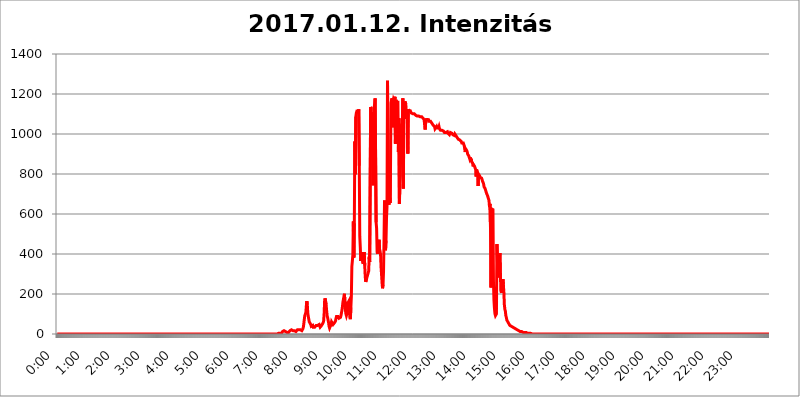
| Category | 2017.01.12. Intenzitás [W/m^2] |
|---|---|
| 0.0 | 0 |
| 0.0006944444444444445 | 0 |
| 0.001388888888888889 | 0 |
| 0.0020833333333333333 | 0 |
| 0.002777777777777778 | 0 |
| 0.003472222222222222 | 0 |
| 0.004166666666666667 | 0 |
| 0.004861111111111111 | 0 |
| 0.005555555555555556 | 0 |
| 0.0062499999999999995 | 0 |
| 0.006944444444444444 | 0 |
| 0.007638888888888889 | 0 |
| 0.008333333333333333 | 0 |
| 0.009027777777777779 | 0 |
| 0.009722222222222222 | 0 |
| 0.010416666666666666 | 0 |
| 0.011111111111111112 | 0 |
| 0.011805555555555555 | 0 |
| 0.012499999999999999 | 0 |
| 0.013194444444444444 | 0 |
| 0.013888888888888888 | 0 |
| 0.014583333333333332 | 0 |
| 0.015277777777777777 | 0 |
| 0.015972222222222224 | 0 |
| 0.016666666666666666 | 0 |
| 0.017361111111111112 | 0 |
| 0.018055555555555557 | 0 |
| 0.01875 | 0 |
| 0.019444444444444445 | 0 |
| 0.02013888888888889 | 0 |
| 0.020833333333333332 | 0 |
| 0.02152777777777778 | 0 |
| 0.022222222222222223 | 0 |
| 0.02291666666666667 | 0 |
| 0.02361111111111111 | 0 |
| 0.024305555555555556 | 0 |
| 0.024999999999999998 | 0 |
| 0.025694444444444447 | 0 |
| 0.02638888888888889 | 0 |
| 0.027083333333333334 | 0 |
| 0.027777777777777776 | 0 |
| 0.02847222222222222 | 0 |
| 0.029166666666666664 | 0 |
| 0.029861111111111113 | 0 |
| 0.030555555555555555 | 0 |
| 0.03125 | 0 |
| 0.03194444444444445 | 0 |
| 0.03263888888888889 | 0 |
| 0.03333333333333333 | 0 |
| 0.034027777777777775 | 0 |
| 0.034722222222222224 | 0 |
| 0.035416666666666666 | 0 |
| 0.036111111111111115 | 0 |
| 0.03680555555555556 | 0 |
| 0.0375 | 0 |
| 0.03819444444444444 | 0 |
| 0.03888888888888889 | 0 |
| 0.03958333333333333 | 0 |
| 0.04027777777777778 | 0 |
| 0.04097222222222222 | 0 |
| 0.041666666666666664 | 0 |
| 0.042361111111111106 | 0 |
| 0.04305555555555556 | 0 |
| 0.043750000000000004 | 0 |
| 0.044444444444444446 | 0 |
| 0.04513888888888889 | 0 |
| 0.04583333333333334 | 0 |
| 0.04652777777777778 | 0 |
| 0.04722222222222222 | 0 |
| 0.04791666666666666 | 0 |
| 0.04861111111111111 | 0 |
| 0.049305555555555554 | 0 |
| 0.049999999999999996 | 0 |
| 0.05069444444444445 | 0 |
| 0.051388888888888894 | 0 |
| 0.052083333333333336 | 0 |
| 0.05277777777777778 | 0 |
| 0.05347222222222222 | 0 |
| 0.05416666666666667 | 0 |
| 0.05486111111111111 | 0 |
| 0.05555555555555555 | 0 |
| 0.05625 | 0 |
| 0.05694444444444444 | 0 |
| 0.057638888888888885 | 0 |
| 0.05833333333333333 | 0 |
| 0.05902777777777778 | 0 |
| 0.059722222222222225 | 0 |
| 0.06041666666666667 | 0 |
| 0.061111111111111116 | 0 |
| 0.06180555555555556 | 0 |
| 0.0625 | 0 |
| 0.06319444444444444 | 0 |
| 0.06388888888888888 | 0 |
| 0.06458333333333334 | 0 |
| 0.06527777777777778 | 0 |
| 0.06597222222222222 | 0 |
| 0.06666666666666667 | 0 |
| 0.06736111111111111 | 0 |
| 0.06805555555555555 | 0 |
| 0.06874999999999999 | 0 |
| 0.06944444444444443 | 0 |
| 0.07013888888888889 | 0 |
| 0.07083333333333333 | 0 |
| 0.07152777777777779 | 0 |
| 0.07222222222222223 | 0 |
| 0.07291666666666667 | 0 |
| 0.07361111111111111 | 0 |
| 0.07430555555555556 | 0 |
| 0.075 | 0 |
| 0.07569444444444444 | 0 |
| 0.0763888888888889 | 0 |
| 0.07708333333333334 | 0 |
| 0.07777777777777778 | 0 |
| 0.07847222222222222 | 0 |
| 0.07916666666666666 | 0 |
| 0.0798611111111111 | 0 |
| 0.08055555555555556 | 0 |
| 0.08125 | 0 |
| 0.08194444444444444 | 0 |
| 0.08263888888888889 | 0 |
| 0.08333333333333333 | 0 |
| 0.08402777777777777 | 0 |
| 0.08472222222222221 | 0 |
| 0.08541666666666665 | 0 |
| 0.08611111111111112 | 0 |
| 0.08680555555555557 | 0 |
| 0.08750000000000001 | 0 |
| 0.08819444444444445 | 0 |
| 0.08888888888888889 | 0 |
| 0.08958333333333333 | 0 |
| 0.09027777777777778 | 0 |
| 0.09097222222222222 | 0 |
| 0.09166666666666667 | 0 |
| 0.09236111111111112 | 0 |
| 0.09305555555555556 | 0 |
| 0.09375 | 0 |
| 0.09444444444444444 | 0 |
| 0.09513888888888888 | 0 |
| 0.09583333333333333 | 0 |
| 0.09652777777777777 | 0 |
| 0.09722222222222222 | 0 |
| 0.09791666666666667 | 0 |
| 0.09861111111111111 | 0 |
| 0.09930555555555555 | 0 |
| 0.09999999999999999 | 0 |
| 0.10069444444444443 | 0 |
| 0.1013888888888889 | 0 |
| 0.10208333333333335 | 0 |
| 0.10277777777777779 | 0 |
| 0.10347222222222223 | 0 |
| 0.10416666666666667 | 0 |
| 0.10486111111111111 | 0 |
| 0.10555555555555556 | 0 |
| 0.10625 | 0 |
| 0.10694444444444444 | 0 |
| 0.1076388888888889 | 0 |
| 0.10833333333333334 | 0 |
| 0.10902777777777778 | 0 |
| 0.10972222222222222 | 0 |
| 0.1111111111111111 | 0 |
| 0.11180555555555556 | 0 |
| 0.11180555555555556 | 0 |
| 0.1125 | 0 |
| 0.11319444444444444 | 0 |
| 0.11388888888888889 | 0 |
| 0.11458333333333333 | 0 |
| 0.11527777777777777 | 0 |
| 0.11597222222222221 | 0 |
| 0.11666666666666665 | 0 |
| 0.1173611111111111 | 0 |
| 0.11805555555555557 | 0 |
| 0.11944444444444445 | 0 |
| 0.12013888888888889 | 0 |
| 0.12083333333333333 | 0 |
| 0.12152777777777778 | 0 |
| 0.12222222222222223 | 0 |
| 0.12291666666666667 | 0 |
| 0.12291666666666667 | 0 |
| 0.12361111111111112 | 0 |
| 0.12430555555555556 | 0 |
| 0.125 | 0 |
| 0.12569444444444444 | 0 |
| 0.12638888888888888 | 0 |
| 0.12708333333333333 | 0 |
| 0.16875 | 0 |
| 0.12847222222222224 | 0 |
| 0.12916666666666668 | 0 |
| 0.12986111111111112 | 0 |
| 0.13055555555555556 | 0 |
| 0.13125 | 0 |
| 0.13194444444444445 | 0 |
| 0.1326388888888889 | 0 |
| 0.13333333333333333 | 0 |
| 0.13402777777777777 | 0 |
| 0.13402777777777777 | 0 |
| 0.13472222222222222 | 0 |
| 0.13541666666666666 | 0 |
| 0.1361111111111111 | 0 |
| 0.13749999999999998 | 0 |
| 0.13819444444444443 | 0 |
| 0.1388888888888889 | 0 |
| 0.13958333333333334 | 0 |
| 0.14027777777777778 | 0 |
| 0.14097222222222222 | 0 |
| 0.14166666666666666 | 0 |
| 0.1423611111111111 | 0 |
| 0.14305555555555557 | 0 |
| 0.14375000000000002 | 0 |
| 0.14444444444444446 | 0 |
| 0.1451388888888889 | 0 |
| 0.1451388888888889 | 0 |
| 0.14652777777777778 | 0 |
| 0.14722222222222223 | 0 |
| 0.14791666666666667 | 0 |
| 0.1486111111111111 | 0 |
| 0.14930555555555555 | 0 |
| 0.15 | 0 |
| 0.15069444444444444 | 0 |
| 0.15138888888888888 | 0 |
| 0.15208333333333332 | 0 |
| 0.15277777777777776 | 0 |
| 0.15347222222222223 | 0 |
| 0.15416666666666667 | 0 |
| 0.15486111111111112 | 0 |
| 0.15555555555555556 | 0 |
| 0.15625 | 0 |
| 0.15694444444444444 | 0 |
| 0.15763888888888888 | 0 |
| 0.15833333333333333 | 0 |
| 0.15902777777777777 | 0 |
| 0.15972222222222224 | 0 |
| 0.16041666666666668 | 0 |
| 0.16111111111111112 | 0 |
| 0.16180555555555556 | 0 |
| 0.1625 | 0 |
| 0.16319444444444445 | 0 |
| 0.1638888888888889 | 0 |
| 0.16458333333333333 | 0 |
| 0.16527777777777777 | 0 |
| 0.16597222222222222 | 0 |
| 0.16666666666666666 | 0 |
| 0.1673611111111111 | 0 |
| 0.16805555555555554 | 0 |
| 0.16874999999999998 | 0 |
| 0.16944444444444443 | 0 |
| 0.17013888888888887 | 0 |
| 0.1708333333333333 | 0 |
| 0.17152777777777775 | 0 |
| 0.17222222222222225 | 0 |
| 0.1729166666666667 | 0 |
| 0.17361111111111113 | 0 |
| 0.17430555555555557 | 0 |
| 0.17500000000000002 | 0 |
| 0.17569444444444446 | 0 |
| 0.1763888888888889 | 0 |
| 0.17708333333333334 | 0 |
| 0.17777777777777778 | 0 |
| 0.17847222222222223 | 0 |
| 0.17916666666666667 | 0 |
| 0.1798611111111111 | 0 |
| 0.18055555555555555 | 0 |
| 0.18125 | 0 |
| 0.18194444444444444 | 0 |
| 0.1826388888888889 | 0 |
| 0.18333333333333335 | 0 |
| 0.1840277777777778 | 0 |
| 0.18472222222222223 | 0 |
| 0.18541666666666667 | 0 |
| 0.18611111111111112 | 0 |
| 0.18680555555555556 | 0 |
| 0.1875 | 0 |
| 0.18819444444444444 | 0 |
| 0.18888888888888888 | 0 |
| 0.18958333333333333 | 0 |
| 0.19027777777777777 | 0 |
| 0.1909722222222222 | 0 |
| 0.19166666666666665 | 0 |
| 0.19236111111111112 | 0 |
| 0.19305555555555554 | 0 |
| 0.19375 | 0 |
| 0.19444444444444445 | 0 |
| 0.1951388888888889 | 0 |
| 0.19583333333333333 | 0 |
| 0.19652777777777777 | 0 |
| 0.19722222222222222 | 0 |
| 0.19791666666666666 | 0 |
| 0.1986111111111111 | 0 |
| 0.19930555555555554 | 0 |
| 0.19999999999999998 | 0 |
| 0.20069444444444443 | 0 |
| 0.20138888888888887 | 0 |
| 0.2020833333333333 | 0 |
| 0.2027777777777778 | 0 |
| 0.2034722222222222 | 0 |
| 0.2041666666666667 | 0 |
| 0.20486111111111113 | 0 |
| 0.20555555555555557 | 0 |
| 0.20625000000000002 | 0 |
| 0.20694444444444446 | 0 |
| 0.2076388888888889 | 0 |
| 0.20833333333333334 | 0 |
| 0.20902777777777778 | 0 |
| 0.20972222222222223 | 0 |
| 0.21041666666666667 | 0 |
| 0.2111111111111111 | 0 |
| 0.21180555555555555 | 0 |
| 0.2125 | 0 |
| 0.21319444444444444 | 0 |
| 0.2138888888888889 | 0 |
| 0.21458333333333335 | 0 |
| 0.2152777777777778 | 0 |
| 0.21597222222222223 | 0 |
| 0.21666666666666667 | 0 |
| 0.21736111111111112 | 0 |
| 0.21805555555555556 | 0 |
| 0.21875 | 0 |
| 0.21944444444444444 | 0 |
| 0.22013888888888888 | 0 |
| 0.22083333333333333 | 0 |
| 0.22152777777777777 | 0 |
| 0.2222222222222222 | 0 |
| 0.22291666666666665 | 0 |
| 0.2236111111111111 | 0 |
| 0.22430555555555556 | 0 |
| 0.225 | 0 |
| 0.22569444444444445 | 0 |
| 0.2263888888888889 | 0 |
| 0.22708333333333333 | 0 |
| 0.22777777777777777 | 0 |
| 0.22847222222222222 | 0 |
| 0.22916666666666666 | 0 |
| 0.2298611111111111 | 0 |
| 0.23055555555555554 | 0 |
| 0.23124999999999998 | 0 |
| 0.23194444444444443 | 0 |
| 0.23263888888888887 | 0 |
| 0.2333333333333333 | 0 |
| 0.2340277777777778 | 0 |
| 0.2347222222222222 | 0 |
| 0.2354166666666667 | 0 |
| 0.23611111111111113 | 0 |
| 0.23680555555555557 | 0 |
| 0.23750000000000002 | 0 |
| 0.23819444444444446 | 0 |
| 0.2388888888888889 | 0 |
| 0.23958333333333334 | 0 |
| 0.24027777777777778 | 0 |
| 0.24097222222222223 | 0 |
| 0.24166666666666667 | 0 |
| 0.2423611111111111 | 0 |
| 0.24305555555555555 | 0 |
| 0.24375 | 0 |
| 0.24444444444444446 | 0 |
| 0.24513888888888888 | 0 |
| 0.24583333333333335 | 0 |
| 0.2465277777777778 | 0 |
| 0.24722222222222223 | 0 |
| 0.24791666666666667 | 0 |
| 0.24861111111111112 | 0 |
| 0.24930555555555556 | 0 |
| 0.25 | 0 |
| 0.25069444444444444 | 0 |
| 0.2513888888888889 | 0 |
| 0.2520833333333333 | 0 |
| 0.25277777777777777 | 0 |
| 0.2534722222222222 | 0 |
| 0.25416666666666665 | 0 |
| 0.2548611111111111 | 0 |
| 0.2555555555555556 | 0 |
| 0.25625000000000003 | 0 |
| 0.2569444444444445 | 0 |
| 0.2576388888888889 | 0 |
| 0.25833333333333336 | 0 |
| 0.2590277777777778 | 0 |
| 0.25972222222222224 | 0 |
| 0.2604166666666667 | 0 |
| 0.2611111111111111 | 0 |
| 0.26180555555555557 | 0 |
| 0.2625 | 0 |
| 0.26319444444444445 | 0 |
| 0.2638888888888889 | 0 |
| 0.26458333333333334 | 0 |
| 0.2652777777777778 | 0 |
| 0.2659722222222222 | 0 |
| 0.26666666666666666 | 0 |
| 0.2673611111111111 | 0 |
| 0.26805555555555555 | 0 |
| 0.26875 | 0 |
| 0.26944444444444443 | 0 |
| 0.2701388888888889 | 0 |
| 0.2708333333333333 | 0 |
| 0.27152777777777776 | 0 |
| 0.2722222222222222 | 0 |
| 0.27291666666666664 | 0 |
| 0.2736111111111111 | 0 |
| 0.2743055555555555 | 0 |
| 0.27499999999999997 | 0 |
| 0.27569444444444446 | 0 |
| 0.27638888888888885 | 0 |
| 0.27708333333333335 | 0 |
| 0.2777777777777778 | 0 |
| 0.27847222222222223 | 0 |
| 0.2791666666666667 | 0 |
| 0.2798611111111111 | 0 |
| 0.28055555555555556 | 0 |
| 0.28125 | 0 |
| 0.28194444444444444 | 0 |
| 0.2826388888888889 | 0 |
| 0.2833333333333333 | 0 |
| 0.28402777777777777 | 0 |
| 0.2847222222222222 | 0 |
| 0.28541666666666665 | 0 |
| 0.28611111111111115 | 0 |
| 0.28680555555555554 | 0 |
| 0.28750000000000003 | 0 |
| 0.2881944444444445 | 0 |
| 0.2888888888888889 | 0 |
| 0.28958333333333336 | 0 |
| 0.2902777777777778 | 0 |
| 0.29097222222222224 | 0 |
| 0.2916666666666667 | 0 |
| 0.2923611111111111 | 0 |
| 0.29305555555555557 | 0 |
| 0.29375 | 0 |
| 0.29444444444444445 | 0 |
| 0.2951388888888889 | 0 |
| 0.29583333333333334 | 0 |
| 0.2965277777777778 | 0 |
| 0.2972222222222222 | 0 |
| 0.29791666666666666 | 0 |
| 0.2986111111111111 | 0 |
| 0.29930555555555555 | 0 |
| 0.3 | 0 |
| 0.30069444444444443 | 0 |
| 0.3013888888888889 | 0 |
| 0.3020833333333333 | 0 |
| 0.30277777777777776 | 0 |
| 0.3034722222222222 | 0 |
| 0.30416666666666664 | 0 |
| 0.3048611111111111 | 0 |
| 0.3055555555555555 | 0 |
| 0.30624999999999997 | 0 |
| 0.3069444444444444 | 0 |
| 0.3076388888888889 | 0 |
| 0.30833333333333335 | 0 |
| 0.3090277777777778 | 0 |
| 0.30972222222222223 | 3.525 |
| 0.3104166666666667 | 3.525 |
| 0.3111111111111111 | 3.525 |
| 0.31180555555555556 | 3.525 |
| 0.3125 | 3.525 |
| 0.31319444444444444 | 3.525 |
| 0.3138888888888889 | 7.887 |
| 0.3145833333333333 | 3.525 |
| 0.31527777777777777 | 7.887 |
| 0.3159722222222222 | 12.257 |
| 0.31666666666666665 | 16.636 |
| 0.31736111111111115 | 16.636 |
| 0.31805555555555554 | 16.636 |
| 0.31875000000000003 | 16.636 |
| 0.3194444444444445 | 16.636 |
| 0.3201388888888889 | 12.257 |
| 0.32083333333333336 | 12.257 |
| 0.3215277777777778 | 12.257 |
| 0.32222222222222224 | 7.887 |
| 0.3229166666666667 | 7.887 |
| 0.3236111111111111 | 7.887 |
| 0.32430555555555557 | 7.887 |
| 0.325 | 12.257 |
| 0.32569444444444445 | 12.257 |
| 0.3263888888888889 | 16.636 |
| 0.32708333333333334 | 21.024 |
| 0.3277777777777778 | 21.024 |
| 0.3284722222222222 | 21.024 |
| 0.32916666666666666 | 21.024 |
| 0.3298611111111111 | 21.024 |
| 0.33055555555555555 | 16.636 |
| 0.33125 | 16.636 |
| 0.33194444444444443 | 16.636 |
| 0.3326388888888889 | 16.636 |
| 0.3333333333333333 | 12.257 |
| 0.3340277777777778 | 12.257 |
| 0.3347222222222222 | 12.257 |
| 0.3354166666666667 | 16.636 |
| 0.3361111111111111 | 16.636 |
| 0.3368055555555556 | 21.024 |
| 0.33749999999999997 | 21.024 |
| 0.33819444444444446 | 21.024 |
| 0.33888888888888885 | 21.024 |
| 0.33958333333333335 | 21.024 |
| 0.34027777777777773 | 21.024 |
| 0.34097222222222223 | 21.024 |
| 0.3416666666666666 | 16.636 |
| 0.3423611111111111 | 16.636 |
| 0.3430555555555555 | 16.636 |
| 0.34375 | 21.024 |
| 0.3444444444444445 | 25.419 |
| 0.3451388888888889 | 34.234 |
| 0.3458333333333334 | 51.951 |
| 0.34652777777777777 | 74.246 |
| 0.34722222222222227 | 92.184 |
| 0.34791666666666665 | 92.184 |
| 0.34861111111111115 | 105.69 |
| 0.34930555555555554 | 137.347 |
| 0.35000000000000003 | 164.605 |
| 0.3506944444444444 | 146.423 |
| 0.3513888888888889 | 105.69 |
| 0.3520833333333333 | 87.692 |
| 0.3527777777777778 | 74.246 |
| 0.3534722222222222 | 60.85 |
| 0.3541666666666667 | 56.398 |
| 0.3548611111111111 | 56.398 |
| 0.35555555555555557 | 47.511 |
| 0.35625 | 38.653 |
| 0.35694444444444445 | 43.079 |
| 0.3576388888888889 | 43.079 |
| 0.35833333333333334 | 43.079 |
| 0.3590277777777778 | 34.234 |
| 0.3597222222222222 | 29.823 |
| 0.36041666666666666 | 29.823 |
| 0.3611111111111111 | 34.234 |
| 0.36180555555555555 | 38.653 |
| 0.3625 | 38.653 |
| 0.36319444444444443 | 43.079 |
| 0.3638888888888889 | 43.079 |
| 0.3645833333333333 | 43.079 |
| 0.3652777777777778 | 43.079 |
| 0.3659722222222222 | 38.653 |
| 0.3666666666666667 | 47.511 |
| 0.3673611111111111 | 47.511 |
| 0.3680555555555556 | 47.511 |
| 0.36874999999999997 | 34.234 |
| 0.36944444444444446 | 29.823 |
| 0.37013888888888885 | 38.653 |
| 0.37083333333333335 | 43.079 |
| 0.37152777777777773 | 47.511 |
| 0.37222222222222223 | 47.511 |
| 0.3729166666666666 | 56.398 |
| 0.3736111111111111 | 65.31 |
| 0.3743055555555555 | 101.184 |
| 0.375 | 164.605 |
| 0.3756944444444445 | 178.264 |
| 0.3763888888888889 | 173.709 |
| 0.3770833333333334 | 146.423 |
| 0.37777777777777777 | 119.235 |
| 0.37847222222222227 | 92.184 |
| 0.37916666666666665 | 83.205 |
| 0.37986111111111115 | 78.722 |
| 0.38055555555555554 | 56.398 |
| 0.38125000000000003 | 38.653 |
| 0.3819444444444444 | 29.823 |
| 0.3826388888888889 | 25.419 |
| 0.3833333333333333 | 29.823 |
| 0.3840277777777778 | 47.511 |
| 0.3847222222222222 | 60.85 |
| 0.3854166666666667 | 56.398 |
| 0.3861111111111111 | 56.398 |
| 0.38680555555555557 | 47.511 |
| 0.3875 | 43.079 |
| 0.38819444444444445 | 51.951 |
| 0.3888888888888889 | 56.398 |
| 0.38958333333333334 | 56.398 |
| 0.3902777777777778 | 65.31 |
| 0.3909722222222222 | 78.722 |
| 0.39166666666666666 | 87.692 |
| 0.3923611111111111 | 87.692 |
| 0.39305555555555555 | 92.184 |
| 0.39375 | 87.692 |
| 0.39444444444444443 | 92.184 |
| 0.3951388888888889 | 78.722 |
| 0.3958333333333333 | 78.722 |
| 0.3965277777777778 | 78.722 |
| 0.3972222222222222 | 83.205 |
| 0.3979166666666667 | 92.184 |
| 0.3986111111111111 | 105.69 |
| 0.3993055555555556 | 119.235 |
| 0.39999999999999997 | 137.347 |
| 0.40069444444444446 | 160.056 |
| 0.40138888888888885 | 173.709 |
| 0.40208333333333335 | 187.378 |
| 0.40277777777777773 | 201.058 |
| 0.40347222222222223 | 196.497 |
| 0.4041666666666666 | 119.235 |
| 0.4048611111111111 | 101.184 |
| 0.4055555555555555 | 92.184 |
| 0.40625 | 101.184 |
| 0.4069444444444445 | 119.235 |
| 0.4076388888888889 | 155.509 |
| 0.4083333333333334 | 155.509 |
| 0.40902777777777777 | 164.605 |
| 0.40972222222222227 | 137.347 |
| 0.41041666666666665 | 83.205 |
| 0.41111111111111115 | 74.246 |
| 0.41180555555555554 | 132.814 |
| 0.41250000000000003 | 187.378 |
| 0.4131944444444444 | 337.639 |
| 0.4138888888888889 | 364.728 |
| 0.4145833333333333 | 396.164 |
| 0.4152777777777778 | 562.53 |
| 0.4159722222222222 | 382.715 |
| 0.4166666666666667 | 553.986 |
| 0.4173611111111111 | 962.555 |
| 0.41805555555555557 | 798.974 |
| 0.41875 | 1086.097 |
| 0.41944444444444445 | 1105.019 |
| 0.4201388888888889 | 1112.618 |
| 0.42083333333333334 | 1112.618 |
| 0.4215277777777778 | 1112.618 |
| 0.4222222222222222 | 1108.816 |
| 0.42291666666666666 | 1124.056 |
| 0.4236111111111111 | 841.526 |
| 0.42430555555555555 | 489.108 |
| 0.425 | 436.27 |
| 0.42569444444444443 | 364.728 |
| 0.4263888888888889 | 364.728 |
| 0.4270833333333333 | 409.574 |
| 0.4277777777777778 | 373.729 |
| 0.4284722222222222 | 360.221 |
| 0.4291666666666667 | 351.198 |
| 0.4298611111111111 | 391.685 |
| 0.4305555555555556 | 409.574 |
| 0.43124999999999997 | 342.162 |
| 0.43194444444444446 | 287.709 |
| 0.43263888888888885 | 260.373 |
| 0.43333333333333335 | 255.813 |
| 0.43402777777777773 | 278.603 |
| 0.43472222222222223 | 287.709 |
| 0.4354166666666666 | 287.709 |
| 0.4361111111111111 | 287.709 |
| 0.4368055555555555 | 314.98 |
| 0.4375 | 387.202 |
| 0.4381944444444445 | 360.221 |
| 0.4388888888888889 | 360.221 |
| 0.4395833333333334 | 1135.543 |
| 0.44027777777777777 | 1127.879 |
| 0.44097222222222227 | 1082.324 |
| 0.44166666666666665 | 1093.653 |
| 0.44236111111111115 | 1108.816 |
| 0.44305555555555554 | 743.859 |
| 0.44375000000000003 | 806.757 |
| 0.4444444444444444 | 1127.879 |
| 0.4451388888888889 | 1150.946 |
| 0.4458333333333333 | 1178.177 |
| 0.4465277777777778 | 1178.177 |
| 0.4472222222222222 | 558.261 |
| 0.4479166666666667 | 528.2 |
| 0.4486111111111111 | 409.574 |
| 0.44930555555555557 | 400.638 |
| 0.45 | 396.164 |
| 0.45069444444444445 | 445.129 |
| 0.4513888888888889 | 471.582 |
| 0.45208333333333334 | 422.943 |
| 0.4527777777777778 | 414.035 |
| 0.4534722222222222 | 396.164 |
| 0.45416666666666666 | 333.113 |
| 0.4548611111111111 | 296.808 |
| 0.45555555555555555 | 255.813 |
| 0.45625 | 228.436 |
| 0.45694444444444443 | 246.689 |
| 0.4576388888888889 | 314.98 |
| 0.4583333333333333 | 475.972 |
| 0.4590277777777778 | 667.123 |
| 0.4597222222222222 | 497.836 |
| 0.4604166666666667 | 418.492 |
| 0.4611111111111111 | 467.187 |
| 0.4618055555555556 | 579.542 |
| 0.46249999999999997 | 638.256 |
| 0.46319444444444446 | 1266.8 |
| 0.46388888888888885 | 849.199 |
| 0.46458333333333335 | 683.473 |
| 0.46527777777777773 | 646.537 |
| 0.46597222222222223 | 783.342 |
| 0.4666666666666666 | 654.791 |
| 0.4673611111111111 | 806.757 |
| 0.4680555555555555 | 1154.814 |
| 0.46875 | 1158.689 |
| 0.4694444444444445 | 1178.177 |
| 0.4701388888888889 | 1033.537 |
| 0.4708333333333334 | 1162.571 |
| 0.47152777777777777 | 1174.263 |
| 0.47222222222222227 | 1178.177 |
| 0.47291666666666665 | 1162.571 |
| 0.47361111111111115 | 1186.03 |
| 0.47430555555555554 | 951.327 |
| 0.47500000000000003 | 1170.358 |
| 0.4756944444444444 | 1158.689 |
| 0.4763888888888889 | 1162.571 |
| 0.4770833333333333 | 1154.814 |
| 0.4777777777777778 | 1158.689 |
| 0.4784722222222222 | 909.996 |
| 0.4791666666666667 | 1078.555 |
| 0.4798611111111111 | 650.667 |
| 0.48055555555555557 | 747.834 |
| 0.48125 | 791.169 |
| 0.48194444444444445 | 1037.277 |
| 0.4826388888888889 | 1037.277 |
| 0.48333333333333334 | 1041.019 |
| 0.4840277777777778 | 1056.004 |
| 0.4847222222222222 | 1178.177 |
| 0.48541666666666666 | 727.896 |
| 0.4861111111111111 | 1127.879 |
| 0.48680555555555555 | 1135.543 |
| 0.4875 | 1162.571 |
| 0.48819444444444443 | 1162.571 |
| 0.4888888888888889 | 1150.946 |
| 0.4895833333333333 | 1074.789 |
| 0.4902777777777778 | 1101.226 |
| 0.4909722222222222 | 1124.056 |
| 0.4916666666666667 | 902.447 |
| 0.4923611111111111 | 1124.056 |
| 0.4930555555555556 | 1116.426 |
| 0.49374999999999997 | 1120.238 |
| 0.49444444444444446 | 1116.426 |
| 0.49513888888888885 | 1116.426 |
| 0.49583333333333335 | 1112.618 |
| 0.49652777777777773 | 1105.019 |
| 0.49722222222222223 | 1101.226 |
| 0.4979166666666666 | 1101.226 |
| 0.4986111111111111 | 1101.226 |
| 0.4993055555555555 | 1097.437 |
| 0.5 | 1097.437 |
| 0.5006944444444444 | 1101.226 |
| 0.5013888888888889 | 1097.437 |
| 0.5020833333333333 | 1097.437 |
| 0.5027777777777778 | 1093.653 |
| 0.5034722222222222 | 1089.873 |
| 0.5041666666666667 | 1089.873 |
| 0.5048611111111111 | 1089.873 |
| 0.5055555555555555 | 1086.097 |
| 0.50625 | 1093.653 |
| 0.5069444444444444 | 1089.873 |
| 0.5076388888888889 | 1093.653 |
| 0.5083333333333333 | 1089.873 |
| 0.5090277777777777 | 1086.097 |
| 0.5097222222222222 | 1082.324 |
| 0.5104166666666666 | 1086.097 |
| 0.5111111111111112 | 1086.097 |
| 0.5118055555555555 | 1082.324 |
| 0.5125000000000001 | 1082.324 |
| 0.5131944444444444 | 1078.555 |
| 0.513888888888889 | 1078.555 |
| 0.5145833333333333 | 1071.027 |
| 0.5152777777777778 | 1044.762 |
| 0.5159722222222222 | 1022.323 |
| 0.5166666666666667 | 1052.255 |
| 0.517361111111111 | 1059.756 |
| 0.5180555555555556 | 1078.555 |
| 0.5187499999999999 | 1071.027 |
| 0.5194444444444445 | 1067.267 |
| 0.5201388888888888 | 1067.267 |
| 0.5208333333333334 | 1071.027 |
| 0.5215277777777778 | 1063.51 |
| 0.5222222222222223 | 1059.756 |
| 0.5229166666666667 | 1059.756 |
| 0.5236111111111111 | 1063.51 |
| 0.5243055555555556 | 1059.756 |
| 0.525 | 1056.004 |
| 0.5256944444444445 | 1052.255 |
| 0.5263888888888889 | 1052.255 |
| 0.5270833333333333 | 1044.762 |
| 0.5277777777777778 | 1044.762 |
| 0.5284722222222222 | 1041.019 |
| 0.5291666666666667 | 1037.277 |
| 0.5298611111111111 | 1026.06 |
| 0.5305555555555556 | 1029.798 |
| 0.53125 | 1029.798 |
| 0.5319444444444444 | 1037.277 |
| 0.5326388888888889 | 1029.798 |
| 0.5333333333333333 | 1029.798 |
| 0.5340277777777778 | 1033.537 |
| 0.5347222222222222 | 1029.798 |
| 0.5354166666666667 | 1037.277 |
| 0.5361111111111111 | 1026.06 |
| 0.5368055555555555 | 1029.798 |
| 0.5375 | 1018.587 |
| 0.5381944444444444 | 1018.587 |
| 0.5388888888888889 | 1014.852 |
| 0.5395833333333333 | 1018.587 |
| 0.5402777777777777 | 1014.852 |
| 0.5409722222222222 | 1022.323 |
| 0.5416666666666666 | 1014.852 |
| 0.5423611111111112 | 1011.118 |
| 0.5430555555555555 | 1007.383 |
| 0.5437500000000001 | 1007.383 |
| 0.5444444444444444 | 1007.383 |
| 0.545138888888889 | 1007.383 |
| 0.5458333333333333 | 1007.383 |
| 0.5465277777777778 | 1011.118 |
| 0.5472222222222222 | 1011.118 |
| 0.5479166666666667 | 1003.65 |
| 0.548611111111111 | 1007.383 |
| 0.5493055555555556 | 1003.65 |
| 0.5499999999999999 | 996.182 |
| 0.5506944444444445 | 999.916 |
| 0.5513888888888888 | 1007.383 |
| 0.5520833333333334 | 1007.383 |
| 0.5527777777777778 | 1011.118 |
| 0.5534722222222223 | 1003.65 |
| 0.5541666666666667 | 999.916 |
| 0.5548611111111111 | 996.182 |
| 0.5555555555555556 | 996.182 |
| 0.55625 | 996.182 |
| 0.5569444444444445 | 992.448 |
| 0.5576388888888889 | 999.916 |
| 0.5583333333333333 | 999.916 |
| 0.5590277777777778 | 992.448 |
| 0.5597222222222222 | 992.448 |
| 0.5604166666666667 | 988.714 |
| 0.5611111111111111 | 981.244 |
| 0.5618055555555556 | 977.508 |
| 0.5625 | 973.772 |
| 0.5631944444444444 | 977.508 |
| 0.5638888888888889 | 973.772 |
| 0.5645833333333333 | 970.034 |
| 0.5652777777777778 | 966.295 |
| 0.5659722222222222 | 966.295 |
| 0.5666666666666667 | 962.555 |
| 0.5673611111111111 | 955.071 |
| 0.5680555555555555 | 955.071 |
| 0.56875 | 958.814 |
| 0.5694444444444444 | 955.071 |
| 0.5701388888888889 | 951.327 |
| 0.5708333333333333 | 940.082 |
| 0.5715277777777777 | 925.06 |
| 0.5722222222222222 | 909.996 |
| 0.5729166666666666 | 925.06 |
| 0.5736111111111112 | 921.298 |
| 0.5743055555555555 | 917.534 |
| 0.5750000000000001 | 909.996 |
| 0.5756944444444444 | 898.668 |
| 0.576388888888889 | 894.885 |
| 0.5770833333333333 | 891.099 |
| 0.5777777777777778 | 887.309 |
| 0.5784722222222222 | 875.918 |
| 0.5791666666666667 | 883.516 |
| 0.579861111111111 | 868.305 |
| 0.5805555555555556 | 875.918 |
| 0.5812499999999999 | 860.676 |
| 0.5819444444444445 | 860.676 |
| 0.5826388888888888 | 853.029 |
| 0.5833333333333334 | 837.682 |
| 0.5840277777777778 | 845.365 |
| 0.5847222222222223 | 841.526 |
| 0.5854166666666667 | 837.682 |
| 0.5861111111111111 | 829.981 |
| 0.5868055555555556 | 822.26 |
| 0.5875 | 787.258 |
| 0.5881944444444445 | 822.26 |
| 0.5888888888888889 | 810.641 |
| 0.5895833333333333 | 802.868 |
| 0.5902777777777778 | 739.877 |
| 0.5909722222222222 | 798.974 |
| 0.5916666666666667 | 802.868 |
| 0.5923611111111111 | 791.169 |
| 0.5930555555555556 | 783.342 |
| 0.59375 | 779.42 |
| 0.5944444444444444 | 779.42 |
| 0.5951388888888889 | 779.42 |
| 0.5958333333333333 | 771.559 |
| 0.5965277777777778 | 763.674 |
| 0.5972222222222222 | 759.723 |
| 0.5979166666666667 | 751.803 |
| 0.5986111111111111 | 735.89 |
| 0.5993055555555555 | 731.896 |
| 0.6 | 727.896 |
| 0.6006944444444444 | 719.877 |
| 0.6013888888888889 | 711.832 |
| 0.6020833333333333 | 703.762 |
| 0.6027777777777777 | 699.717 |
| 0.6034722222222222 | 691.608 |
| 0.6041666666666666 | 683.473 |
| 0.6048611111111112 | 683.473 |
| 0.6055555555555555 | 667.123 |
| 0.6062500000000001 | 634.105 |
| 0.6069444444444444 | 650.667 |
| 0.607638888888889 | 532.513 |
| 0.6083333333333333 | 233 |
| 0.6090277777777778 | 625.784 |
| 0.6097222222222222 | 629.948 |
| 0.6104166666666667 | 629.948 |
| 0.611111111111111 | 621.613 |
| 0.6118055555555556 | 260.373 |
| 0.6124999999999999 | 169.156 |
| 0.6131944444444445 | 128.284 |
| 0.6138888888888888 | 101.184 |
| 0.6145833333333334 | 92.184 |
| 0.6152777777777778 | 87.692 |
| 0.6159722222222223 | 101.184 |
| 0.6166666666666667 | 449.551 |
| 0.6173611111111111 | 453.968 |
| 0.6180555555555556 | 283.156 |
| 0.61875 | 405.108 |
| 0.6194444444444445 | 355.712 |
| 0.6201388888888889 | 382.715 |
| 0.6208333333333333 | 405.108 |
| 0.6215277777777778 | 301.354 |
| 0.6222222222222222 | 214.746 |
| 0.6229166666666667 | 205.62 |
| 0.6236111111111111 | 233 |
| 0.6243055555555556 | 219.309 |
| 0.625 | 274.047 |
| 0.6256944444444444 | 246.689 |
| 0.6263888888888889 | 210.182 |
| 0.6270833333333333 | 146.423 |
| 0.6277777777777778 | 123.758 |
| 0.6284722222222222 | 114.716 |
| 0.6291666666666667 | 92.184 |
| 0.6298611111111111 | 83.205 |
| 0.6305555555555555 | 69.775 |
| 0.63125 | 65.31 |
| 0.6319444444444444 | 60.85 |
| 0.6326388888888889 | 56.398 |
| 0.6333333333333333 | 51.951 |
| 0.6340277777777777 | 47.511 |
| 0.6347222222222222 | 43.079 |
| 0.6354166666666666 | 38.653 |
| 0.6361111111111112 | 38.653 |
| 0.6368055555555555 | 38.653 |
| 0.6375000000000001 | 34.234 |
| 0.6381944444444444 | 34.234 |
| 0.638888888888889 | 34.234 |
| 0.6395833333333333 | 34.234 |
| 0.6402777777777778 | 29.823 |
| 0.6409722222222222 | 29.823 |
| 0.6416666666666667 | 25.419 |
| 0.642361111111111 | 25.419 |
| 0.6430555555555556 | 25.419 |
| 0.6437499999999999 | 21.024 |
| 0.6444444444444445 | 21.024 |
| 0.6451388888888888 | 21.024 |
| 0.6458333333333334 | 16.636 |
| 0.6465277777777778 | 16.636 |
| 0.6472222222222223 | 16.636 |
| 0.6479166666666667 | 12.257 |
| 0.6486111111111111 | 12.257 |
| 0.6493055555555556 | 12.257 |
| 0.65 | 12.257 |
| 0.6506944444444445 | 12.257 |
| 0.6513888888888889 | 12.257 |
| 0.6520833333333333 | 7.887 |
| 0.6527777777777778 | 7.887 |
| 0.6534722222222222 | 7.887 |
| 0.6541666666666667 | 7.887 |
| 0.6548611111111111 | 7.887 |
| 0.6555555555555556 | 7.887 |
| 0.65625 | 7.887 |
| 0.6569444444444444 | 7.887 |
| 0.6576388888888889 | 7.887 |
| 0.6583333333333333 | 3.525 |
| 0.6590277777777778 | 3.525 |
| 0.6597222222222222 | 3.525 |
| 0.6604166666666667 | 3.525 |
| 0.6611111111111111 | 3.525 |
| 0.6618055555555555 | 3.525 |
| 0.6625 | 3.525 |
| 0.6631944444444444 | 3.525 |
| 0.6638888888888889 | 3.525 |
| 0.6645833333333333 | 3.525 |
| 0.6652777777777777 | 3.525 |
| 0.6659722222222222 | 0 |
| 0.6666666666666666 | 0 |
| 0.6673611111111111 | 0 |
| 0.6680555555555556 | 0 |
| 0.6687500000000001 | 0 |
| 0.6694444444444444 | 0 |
| 0.6701388888888888 | 0 |
| 0.6708333333333334 | 0 |
| 0.6715277777777778 | 0 |
| 0.6722222222222222 | 0 |
| 0.6729166666666666 | 0 |
| 0.6736111111111112 | 0 |
| 0.6743055555555556 | 0 |
| 0.6749999999999999 | 0 |
| 0.6756944444444444 | 0 |
| 0.6763888888888889 | 0 |
| 0.6770833333333334 | 0 |
| 0.6777777777777777 | 0 |
| 0.6784722222222223 | 0 |
| 0.6791666666666667 | 0 |
| 0.6798611111111111 | 0 |
| 0.6805555555555555 | 0 |
| 0.68125 | 0 |
| 0.6819444444444445 | 0 |
| 0.6826388888888889 | 0 |
| 0.6833333333333332 | 0 |
| 0.6840277777777778 | 0 |
| 0.6847222222222222 | 0 |
| 0.6854166666666667 | 0 |
| 0.686111111111111 | 0 |
| 0.6868055555555556 | 0 |
| 0.6875 | 0 |
| 0.6881944444444444 | 0 |
| 0.688888888888889 | 0 |
| 0.6895833333333333 | 0 |
| 0.6902777777777778 | 0 |
| 0.6909722222222222 | 0 |
| 0.6916666666666668 | 0 |
| 0.6923611111111111 | 0 |
| 0.6930555555555555 | 0 |
| 0.69375 | 0 |
| 0.6944444444444445 | 0 |
| 0.6951388888888889 | 0 |
| 0.6958333333333333 | 0 |
| 0.6965277777777777 | 0 |
| 0.6972222222222223 | 0 |
| 0.6979166666666666 | 0 |
| 0.6986111111111111 | 0 |
| 0.6993055555555556 | 0 |
| 0.7000000000000001 | 0 |
| 0.7006944444444444 | 0 |
| 0.7013888888888888 | 0 |
| 0.7020833333333334 | 0 |
| 0.7027777777777778 | 0 |
| 0.7034722222222222 | 0 |
| 0.7041666666666666 | 0 |
| 0.7048611111111112 | 0 |
| 0.7055555555555556 | 0 |
| 0.7062499999999999 | 0 |
| 0.7069444444444444 | 0 |
| 0.7076388888888889 | 0 |
| 0.7083333333333334 | 0 |
| 0.7090277777777777 | 0 |
| 0.7097222222222223 | 0 |
| 0.7104166666666667 | 0 |
| 0.7111111111111111 | 0 |
| 0.7118055555555555 | 0 |
| 0.7125 | 0 |
| 0.7131944444444445 | 0 |
| 0.7138888888888889 | 0 |
| 0.7145833333333332 | 0 |
| 0.7152777777777778 | 0 |
| 0.7159722222222222 | 0 |
| 0.7166666666666667 | 0 |
| 0.717361111111111 | 0 |
| 0.7180555555555556 | 0 |
| 0.71875 | 0 |
| 0.7194444444444444 | 0 |
| 0.720138888888889 | 0 |
| 0.7208333333333333 | 0 |
| 0.7215277777777778 | 0 |
| 0.7222222222222222 | 0 |
| 0.7229166666666668 | 0 |
| 0.7236111111111111 | 0 |
| 0.7243055555555555 | 0 |
| 0.725 | 0 |
| 0.7256944444444445 | 0 |
| 0.7263888888888889 | 0 |
| 0.7270833333333333 | 0 |
| 0.7277777777777777 | 0 |
| 0.7284722222222223 | 0 |
| 0.7291666666666666 | 0 |
| 0.7298611111111111 | 0 |
| 0.7305555555555556 | 0 |
| 0.7312500000000001 | 0 |
| 0.7319444444444444 | 0 |
| 0.7326388888888888 | 0 |
| 0.7333333333333334 | 0 |
| 0.7340277777777778 | 0 |
| 0.7347222222222222 | 0 |
| 0.7354166666666666 | 0 |
| 0.7361111111111112 | 0 |
| 0.7368055555555556 | 0 |
| 0.7374999999999999 | 0 |
| 0.7381944444444444 | 0 |
| 0.7388888888888889 | 0 |
| 0.7395833333333334 | 0 |
| 0.7402777777777777 | 0 |
| 0.7409722222222223 | 0 |
| 0.7416666666666667 | 0 |
| 0.7423611111111111 | 0 |
| 0.7430555555555555 | 0 |
| 0.74375 | 0 |
| 0.7444444444444445 | 0 |
| 0.7451388888888889 | 0 |
| 0.7458333333333332 | 0 |
| 0.7465277777777778 | 0 |
| 0.7472222222222222 | 0 |
| 0.7479166666666667 | 0 |
| 0.748611111111111 | 0 |
| 0.7493055555555556 | 0 |
| 0.75 | 0 |
| 0.7506944444444444 | 0 |
| 0.751388888888889 | 0 |
| 0.7520833333333333 | 0 |
| 0.7527777777777778 | 0 |
| 0.7534722222222222 | 0 |
| 0.7541666666666668 | 0 |
| 0.7548611111111111 | 0 |
| 0.7555555555555555 | 0 |
| 0.75625 | 0 |
| 0.7569444444444445 | 0 |
| 0.7576388888888889 | 0 |
| 0.7583333333333333 | 0 |
| 0.7590277777777777 | 0 |
| 0.7597222222222223 | 0 |
| 0.7604166666666666 | 0 |
| 0.7611111111111111 | 0 |
| 0.7618055555555556 | 0 |
| 0.7625000000000001 | 0 |
| 0.7631944444444444 | 0 |
| 0.7638888888888888 | 0 |
| 0.7645833333333334 | 0 |
| 0.7652777777777778 | 0 |
| 0.7659722222222222 | 0 |
| 0.7666666666666666 | 0 |
| 0.7673611111111112 | 0 |
| 0.7680555555555556 | 0 |
| 0.7687499999999999 | 0 |
| 0.7694444444444444 | 0 |
| 0.7701388888888889 | 0 |
| 0.7708333333333334 | 0 |
| 0.7715277777777777 | 0 |
| 0.7722222222222223 | 0 |
| 0.7729166666666667 | 0 |
| 0.7736111111111111 | 0 |
| 0.7743055555555555 | 0 |
| 0.775 | 0 |
| 0.7756944444444445 | 0 |
| 0.7763888888888889 | 0 |
| 0.7770833333333332 | 0 |
| 0.7777777777777778 | 0 |
| 0.7784722222222222 | 0 |
| 0.7791666666666667 | 0 |
| 0.779861111111111 | 0 |
| 0.7805555555555556 | 0 |
| 0.78125 | 0 |
| 0.7819444444444444 | 0 |
| 0.782638888888889 | 0 |
| 0.7833333333333333 | 0 |
| 0.7840277777777778 | 0 |
| 0.7847222222222222 | 0 |
| 0.7854166666666668 | 0 |
| 0.7861111111111111 | 0 |
| 0.7868055555555555 | 0 |
| 0.7875 | 0 |
| 0.7881944444444445 | 0 |
| 0.7888888888888889 | 0 |
| 0.7895833333333333 | 0 |
| 0.7902777777777777 | 0 |
| 0.7909722222222223 | 0 |
| 0.7916666666666666 | 0 |
| 0.7923611111111111 | 0 |
| 0.7930555555555556 | 0 |
| 0.7937500000000001 | 0 |
| 0.7944444444444444 | 0 |
| 0.7951388888888888 | 0 |
| 0.7958333333333334 | 0 |
| 0.7965277777777778 | 0 |
| 0.7972222222222222 | 0 |
| 0.7979166666666666 | 0 |
| 0.7986111111111112 | 0 |
| 0.7993055555555556 | 0 |
| 0.7999999999999999 | 0 |
| 0.8006944444444444 | 0 |
| 0.8013888888888889 | 0 |
| 0.8020833333333334 | 0 |
| 0.8027777777777777 | 0 |
| 0.8034722222222223 | 0 |
| 0.8041666666666667 | 0 |
| 0.8048611111111111 | 0 |
| 0.8055555555555555 | 0 |
| 0.80625 | 0 |
| 0.8069444444444445 | 0 |
| 0.8076388888888889 | 0 |
| 0.8083333333333332 | 0 |
| 0.8090277777777778 | 0 |
| 0.8097222222222222 | 0 |
| 0.8104166666666667 | 0 |
| 0.811111111111111 | 0 |
| 0.8118055555555556 | 0 |
| 0.8125 | 0 |
| 0.8131944444444444 | 0 |
| 0.813888888888889 | 0 |
| 0.8145833333333333 | 0 |
| 0.8152777777777778 | 0 |
| 0.8159722222222222 | 0 |
| 0.8166666666666668 | 0 |
| 0.8173611111111111 | 0 |
| 0.8180555555555555 | 0 |
| 0.81875 | 0 |
| 0.8194444444444445 | 0 |
| 0.8201388888888889 | 0 |
| 0.8208333333333333 | 0 |
| 0.8215277777777777 | 0 |
| 0.8222222222222223 | 0 |
| 0.8229166666666666 | 0 |
| 0.8236111111111111 | 0 |
| 0.8243055555555556 | 0 |
| 0.8250000000000001 | 0 |
| 0.8256944444444444 | 0 |
| 0.8263888888888888 | 0 |
| 0.8270833333333334 | 0 |
| 0.8277777777777778 | 0 |
| 0.8284722222222222 | 0 |
| 0.8291666666666666 | 0 |
| 0.8298611111111112 | 0 |
| 0.8305555555555556 | 0 |
| 0.8312499999999999 | 0 |
| 0.8319444444444444 | 0 |
| 0.8326388888888889 | 0 |
| 0.8333333333333334 | 0 |
| 0.8340277777777777 | 0 |
| 0.8347222222222223 | 0 |
| 0.8354166666666667 | 0 |
| 0.8361111111111111 | 0 |
| 0.8368055555555555 | 0 |
| 0.8375 | 0 |
| 0.8381944444444445 | 0 |
| 0.8388888888888889 | 0 |
| 0.8395833333333332 | 0 |
| 0.8402777777777778 | 0 |
| 0.8409722222222222 | 0 |
| 0.8416666666666667 | 0 |
| 0.842361111111111 | 0 |
| 0.8430555555555556 | 0 |
| 0.84375 | 0 |
| 0.8444444444444444 | 0 |
| 0.845138888888889 | 0 |
| 0.8458333333333333 | 0 |
| 0.8465277777777778 | 0 |
| 0.8472222222222222 | 0 |
| 0.8479166666666668 | 0 |
| 0.8486111111111111 | 0 |
| 0.8493055555555555 | 0 |
| 0.85 | 0 |
| 0.8506944444444445 | 0 |
| 0.8513888888888889 | 0 |
| 0.8520833333333333 | 0 |
| 0.8527777777777777 | 0 |
| 0.8534722222222223 | 0 |
| 0.8541666666666666 | 0 |
| 0.8548611111111111 | 0 |
| 0.8555555555555556 | 0 |
| 0.8562500000000001 | 0 |
| 0.8569444444444444 | 0 |
| 0.8576388888888888 | 0 |
| 0.8583333333333334 | 0 |
| 0.8590277777777778 | 0 |
| 0.8597222222222222 | 0 |
| 0.8604166666666666 | 0 |
| 0.8611111111111112 | 0 |
| 0.8618055555555556 | 0 |
| 0.8624999999999999 | 0 |
| 0.8631944444444444 | 0 |
| 0.8638888888888889 | 0 |
| 0.8645833333333334 | 0 |
| 0.8652777777777777 | 0 |
| 0.8659722222222223 | 0 |
| 0.8666666666666667 | 0 |
| 0.8673611111111111 | 0 |
| 0.8680555555555555 | 0 |
| 0.86875 | 0 |
| 0.8694444444444445 | 0 |
| 0.8701388888888889 | 0 |
| 0.8708333333333332 | 0 |
| 0.8715277777777778 | 0 |
| 0.8722222222222222 | 0 |
| 0.8729166666666667 | 0 |
| 0.873611111111111 | 0 |
| 0.8743055555555556 | 0 |
| 0.875 | 0 |
| 0.8756944444444444 | 0 |
| 0.876388888888889 | 0 |
| 0.8770833333333333 | 0 |
| 0.8777777777777778 | 0 |
| 0.8784722222222222 | 0 |
| 0.8791666666666668 | 0 |
| 0.8798611111111111 | 0 |
| 0.8805555555555555 | 0 |
| 0.88125 | 0 |
| 0.8819444444444445 | 0 |
| 0.8826388888888889 | 0 |
| 0.8833333333333333 | 0 |
| 0.8840277777777777 | 0 |
| 0.8847222222222223 | 0 |
| 0.8854166666666666 | 0 |
| 0.8861111111111111 | 0 |
| 0.8868055555555556 | 0 |
| 0.8875000000000001 | 0 |
| 0.8881944444444444 | 0 |
| 0.8888888888888888 | 0 |
| 0.8895833333333334 | 0 |
| 0.8902777777777778 | 0 |
| 0.8909722222222222 | 0 |
| 0.8916666666666666 | 0 |
| 0.8923611111111112 | 0 |
| 0.8930555555555556 | 0 |
| 0.8937499999999999 | 0 |
| 0.8944444444444444 | 0 |
| 0.8951388888888889 | 0 |
| 0.8958333333333334 | 0 |
| 0.8965277777777777 | 0 |
| 0.8972222222222223 | 0 |
| 0.8979166666666667 | 0 |
| 0.8986111111111111 | 0 |
| 0.8993055555555555 | 0 |
| 0.9 | 0 |
| 0.9006944444444445 | 0 |
| 0.9013888888888889 | 0 |
| 0.9020833333333332 | 0 |
| 0.9027777777777778 | 0 |
| 0.9034722222222222 | 0 |
| 0.9041666666666667 | 0 |
| 0.904861111111111 | 0 |
| 0.9055555555555556 | 0 |
| 0.90625 | 0 |
| 0.9069444444444444 | 0 |
| 0.907638888888889 | 0 |
| 0.9083333333333333 | 0 |
| 0.9090277777777778 | 0 |
| 0.9097222222222222 | 0 |
| 0.9104166666666668 | 0 |
| 0.9111111111111111 | 0 |
| 0.9118055555555555 | 0 |
| 0.9125 | 0 |
| 0.9131944444444445 | 0 |
| 0.9138888888888889 | 0 |
| 0.9145833333333333 | 0 |
| 0.9152777777777777 | 0 |
| 0.9159722222222223 | 0 |
| 0.9166666666666666 | 0 |
| 0.9173611111111111 | 0 |
| 0.9180555555555556 | 0 |
| 0.9187500000000001 | 0 |
| 0.9194444444444444 | 0 |
| 0.9201388888888888 | 0 |
| 0.9208333333333334 | 0 |
| 0.9215277777777778 | 0 |
| 0.9222222222222222 | 0 |
| 0.9229166666666666 | 0 |
| 0.9236111111111112 | 0 |
| 0.9243055555555556 | 0 |
| 0.9249999999999999 | 0 |
| 0.9256944444444444 | 0 |
| 0.9263888888888889 | 0 |
| 0.9270833333333334 | 0 |
| 0.9277777777777777 | 0 |
| 0.9284722222222223 | 0 |
| 0.9291666666666667 | 0 |
| 0.9298611111111111 | 0 |
| 0.9305555555555555 | 0 |
| 0.93125 | 0 |
| 0.9319444444444445 | 0 |
| 0.9326388888888889 | 0 |
| 0.9333333333333332 | 0 |
| 0.9340277777777778 | 0 |
| 0.9347222222222222 | 0 |
| 0.9354166666666667 | 0 |
| 0.936111111111111 | 0 |
| 0.9368055555555556 | 0 |
| 0.9375 | 0 |
| 0.9381944444444444 | 0 |
| 0.938888888888889 | 0 |
| 0.9395833333333333 | 0 |
| 0.9402777777777778 | 0 |
| 0.9409722222222222 | 0 |
| 0.9416666666666668 | 0 |
| 0.9423611111111111 | 0 |
| 0.9430555555555555 | 0 |
| 0.94375 | 0 |
| 0.9444444444444445 | 0 |
| 0.9451388888888889 | 0 |
| 0.9458333333333333 | 0 |
| 0.9465277777777777 | 0 |
| 0.9472222222222223 | 0 |
| 0.9479166666666666 | 0 |
| 0.9486111111111111 | 0 |
| 0.9493055555555556 | 0 |
| 0.9500000000000001 | 0 |
| 0.9506944444444444 | 0 |
| 0.9513888888888888 | 0 |
| 0.9520833333333334 | 0 |
| 0.9527777777777778 | 0 |
| 0.9534722222222222 | 0 |
| 0.9541666666666666 | 0 |
| 0.9548611111111112 | 0 |
| 0.9555555555555556 | 0 |
| 0.9562499999999999 | 0 |
| 0.9569444444444444 | 0 |
| 0.9576388888888889 | 0 |
| 0.9583333333333334 | 0 |
| 0.9590277777777777 | 0 |
| 0.9597222222222223 | 0 |
| 0.9604166666666667 | 0 |
| 0.9611111111111111 | 0 |
| 0.9618055555555555 | 0 |
| 0.9625 | 0 |
| 0.9631944444444445 | 0 |
| 0.9638888888888889 | 0 |
| 0.9645833333333332 | 0 |
| 0.9652777777777778 | 0 |
| 0.9659722222222222 | 0 |
| 0.9666666666666667 | 0 |
| 0.967361111111111 | 0 |
| 0.9680555555555556 | 0 |
| 0.96875 | 0 |
| 0.9694444444444444 | 0 |
| 0.970138888888889 | 0 |
| 0.9708333333333333 | 0 |
| 0.9715277777777778 | 0 |
| 0.9722222222222222 | 0 |
| 0.9729166666666668 | 0 |
| 0.9736111111111111 | 0 |
| 0.9743055555555555 | 0 |
| 0.975 | 0 |
| 0.9756944444444445 | 0 |
| 0.9763888888888889 | 0 |
| 0.9770833333333333 | 0 |
| 0.9777777777777777 | 0 |
| 0.9784722222222223 | 0 |
| 0.9791666666666666 | 0 |
| 0.9798611111111111 | 0 |
| 0.9805555555555556 | 0 |
| 0.9812500000000001 | 0 |
| 0.9819444444444444 | 0 |
| 0.9826388888888888 | 0 |
| 0.9833333333333334 | 0 |
| 0.9840277777777778 | 0 |
| 0.9847222222222222 | 0 |
| 0.9854166666666666 | 0 |
| 0.9861111111111112 | 0 |
| 0.9868055555555556 | 0 |
| 0.9874999999999999 | 0 |
| 0.9881944444444444 | 0 |
| 0.9888888888888889 | 0 |
| 0.9895833333333334 | 0 |
| 0.9902777777777777 | 0 |
| 0.9909722222222223 | 0 |
| 0.9916666666666667 | 0 |
| 0.9923611111111111 | 0 |
| 0.9930555555555555 | 0 |
| 0.99375 | 0 |
| 0.9944444444444445 | 0 |
| 0.9951388888888889 | 0 |
| 0.9958333333333332 | 0 |
| 0.9965277777777778 | 0 |
| 0.9972222222222222 | 0 |
| 0.9979166666666667 | 0 |
| 0.998611111111111 | 0 |
| 0.9993055555555556 | 0 |